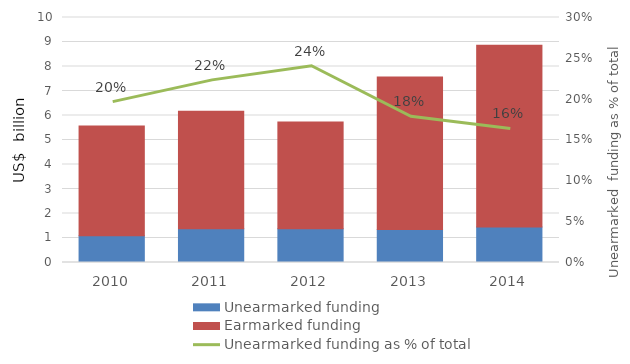
| Category | Unearmarked funding | Earmarked funding |
|---|---|---|
| 2010.0 | 1.095 | 4.481 |
| 2011.0 | 1.378 | 4.8 |
| 2012.0 | 1.379 | 4.359 |
| 2013.0 | 1.351 | 6.219 |
| 2014.0 | 1.451 | 7.421 |